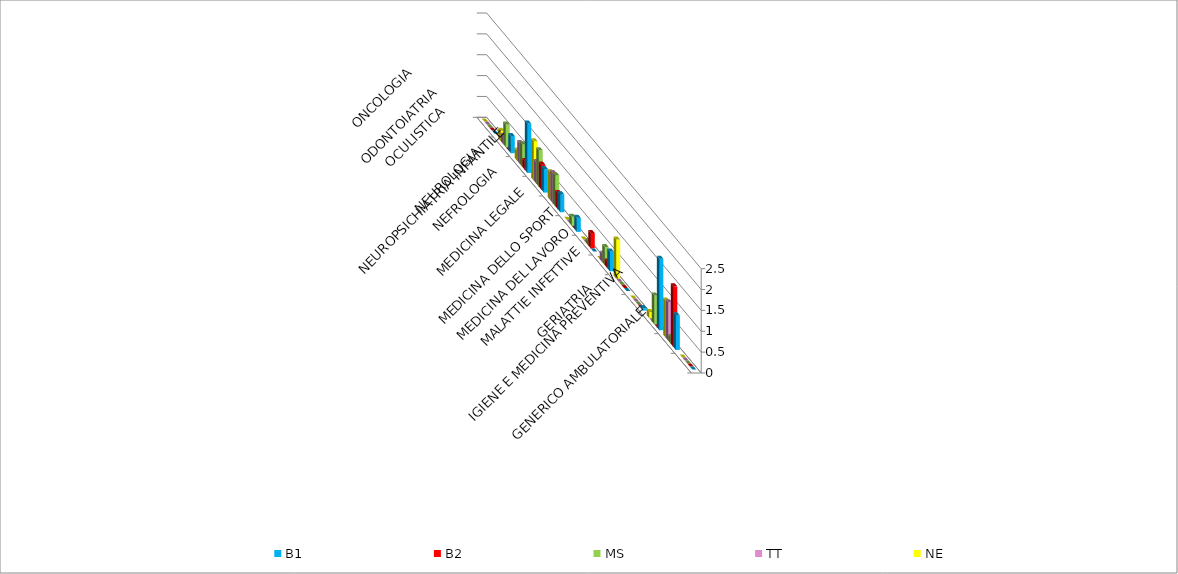
| Category | B1 | B2 | MS | TT | NE |
|---|---|---|---|---|---|
| GENERICO AMBULATORIALE | 0 | 0 | 0 | 0 | 0 |
| GERIATRIA | 0.828 | 1.451 | 0.163 | 0.922 | 0.891 |
| IGIENE E MEDICINA PREVENTIVA | 1.715 | 0 | 0.687 | 0 | 0.148 |
| MALATTIE INFETTIVE | 0.059 | 0 | 0 | 0 | 0 |
| MEDICINA DEL LAVORO | 0 | 0 | 0 | 0 | 0.94 |
| MEDICINA DELLO SPORT | 0.473 | 0.159 | 0.434 | 0.203 | 0 |
| MEDICINA LEGALE | 0 | 0.372 | 0.109 | 0 | 0 |
| NEFROLOGIA | 0.34 | 0 | 0.217 | 0 | 0 |
| NEUROLOGIA | 0.429 | 0.389 | 0.742 | 0.719 | 0.668 |
| NEUROPSICHIATRIA INFANTILE | 0.562 | 0.601 | 0.868 | 0.517 | 0.94 |
| OCULISTICA | 1.183 | 0.212 | 0.543 | 0.498 | 0.247 |
| ODONTOIATRIA | 0.414 | 0 | 0.543 | 0.203 | 0.247 |
| ONCOLOGIA | 0 | 0 | 0 | 0 | 0 |